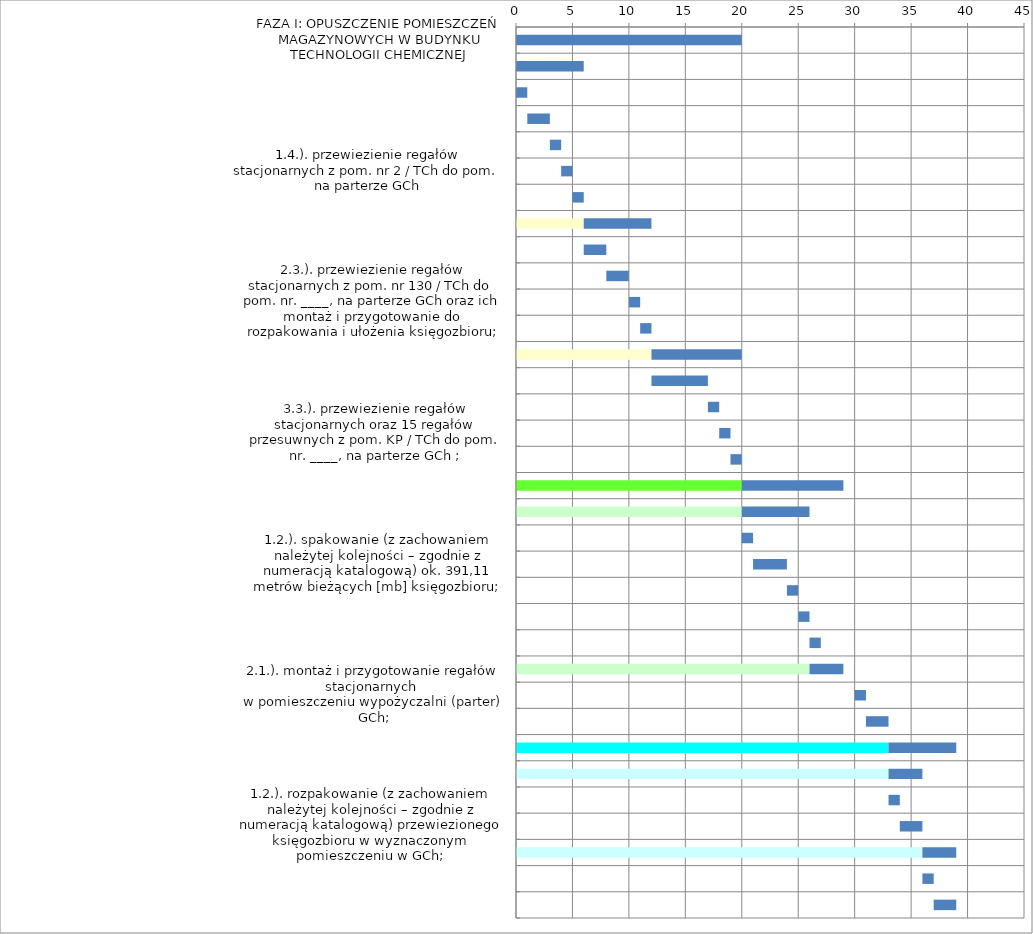
| Category | Series 1 | Series 0 |
|---|---|---|
| FAZA I: OPUSZCZENIE POMIESZCZEŃ MAGAZYNOWYCH W BUDYNKU TECHNOLOGII CHEMICZNEJ | 0 | 20 |
| 1. ETAP: Opuszczenie  magazynu - pom. nr 2 (parter) 
i transport księgozbioru do nowej lokalizacji | 0 | 6 |
| 1.1.). dostarczenie pojemników (i/lub kartonów) do spakowania księgozbioru | 0 | 1 |
| 1.2.). spakowanie (z zachowaniem należytej kolejności – zgodnie z numeracją katalogową) ok. 187,42 metrów bieżących [mb] księgozbioru; | 1 | 2 |
| 1.3.). demontaż i przygotowanie do przewiezienia 23 regałów stacjonarnych; | 3 | 1 |
| 1.4.). przewiezienie regałów stacjonarnych z pom. nr 2 / TCh do pom. na parterze GCh | 4 | 1 |
| 1.5.). przewiezienie księgozbioru do wyznaczonego pomieszczenia 
w Gmachu Chemii; | 5 | 1 |
| 2. ETAP: Opuszczenie  magazynu - pom. nr 130 (I piętro) i oraz transport księgozbioru do nowej lokalizacji | 6 | 6 |
| 2.1.). dostarczenie pojemników oraz spakowanie (z zachowaniem należytej kolejności – zgodnie z numeracją katalogową) ok. 128,88 metrów bieżących [mb] księgozbioru; | 6 | 2 |
| 2.2.). demontaż i przygotowanie do przewiezienia 16 regałów stacjonarnych; | 8 | 2 |
| 2.3.). przewiezienie regałów stacjonarnych z pom. nr 130 / TCh do pom. nr. ____, na parterze GCh oraz ich montaż i przygotowanie do rozpakowania i ułożenia księgozbioru; | 10 | 1 |
| 2.4.). przewiezienie księgozbioru do wyznaczonej lokalizacji w pomieszczeniu w GCh; | 11 | 1 |
| 3. ETAP: Opuszczenie  magazynu - pom. KP (parter) transport księgozbioru i czasopism do nowej lokalizacji | 12 | 8 |
| 3.1.). dostarczenie odpowiednich pojemników (i/lub kartonów) do spakowania księgozbioru oraz jego spakowanie (z zachowaniem należytej kolejności – zgodnie z numeracją katalogową) ok. 941,38 metrów bieżących [mb] księgozbioru i czasopism; | 12 | 5 |
| 3.2.). demontaż i przygotowanie do przewiezienia 10 regałów stacjonarnych; | 17 | 1 |
| 3.3.). przewiezienie regałów stacjonarnych oraz 15 regałów przesuwnych z pom. KP / TCh do pom. nr. ____, na parterze GCh ; | 18 | 1 |
| 3.4.). przewiezienie księgozbioru i czasopism do wyznaczonego pomieszczenia w GCh; | 19 | 1 |
| FAZA II: OPUSZCZENIE POMIESZCZEŃ ORAZ ORGANIZACJA  WYPOŻYCZALNI W NOWEJ LOKALIZACJI W GMACHU CHEMII | 20 | 9 |
| 1. ETAP: Opuszczenie  pomieszczenia wypożyczalni | 20 | 6 |
| 1.1.). dostarczenie odpowiednich pojemników (i/lub kartonów) do spakowania księgozbioru 
znajdujacego się w wypożyczalni CHFBG,  | 20 | 1 |
| 1.2.). spakowanie (z zachowaniem należytej kolejności – zgodnie z numeracją katalogową) ok. 391,11 metrów bieżących [mb] księgozbioru; | 21 | 3 |
| 1.3.). demontaż i przygotowanie do przewiezienia 25 regałów stacjonarnych; | 24 | 1 |
| 1.4.). transport regałów stacjonarnych z wypożyczalni / GCh do pom. nr. ____, na parterze GCh. | 25 | 1 |
| 1.5.). przewiezienie czasopism i księgozbioru do wyznaczonego pomieszczenia w GCh; | 26 | 1 |
| 2. ETAP: Organizacja wypożyczalni w nowej lokalizacji  | 26 | 3 |
| 2.1.). montaż i przygotowanie regałów stacjonarnych 
w pomieszczeniu wypożyczalni (parter) GCh; | 30 | 1 |
| 2.2.).rozpakowanie (z zachowaniem należytej kolejności – zgodnie z numeracją katalogową) przewiezionego księgozbioru w wyznaczonym pomieszczeniu wypożyczalni w GCh; | 31 | 2 |
| FAZA III: ORGANIZACJA POMIESZCZEŃ MAGAZYNOWYCH 
W GMACHU CHEMII | 33 | 6 |
| 1. ETAP: Organizacja pomieszczenia przeznaczonego na księgozbór | 33 | 3 |
| 1.1.). montaż regałów stacjonarnych w pomieszczeniu magazynu księgozbioru (parter) GCh; | 33 | 1 |
| 1.2.). rozpakowanie (z zachowaniem należytej kolejności – zgodnie z numeracją katalogową) przewiezionego księgozbioru w wyznaczonym pomieszczeniu w GCh; | 34 | 2 |
| 2. ETAP: Organizacja pomieszczenia magazynowego przeznaczonego na czasopisma i księgozbór | 36 | 3 |
| 2.1.). montaż dodatkowych regałów stacjonarnych 
w pomieszczeniu magazynu czasopism (parter) GCh; | 36 | 1 |
| 2.2.). rozpakowanie (z zachowaniem należytej kolejności – zgodnie z numeracją katalogową) przewiezionego księgozbioru i czasopism w wyznaczonym pomieszczeniu w GCh; | 37 | 2 |